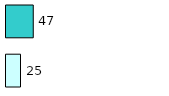
| Category | Series 0 | Series 1 |
|---|---|---|
| 0 | 25 | 47 |